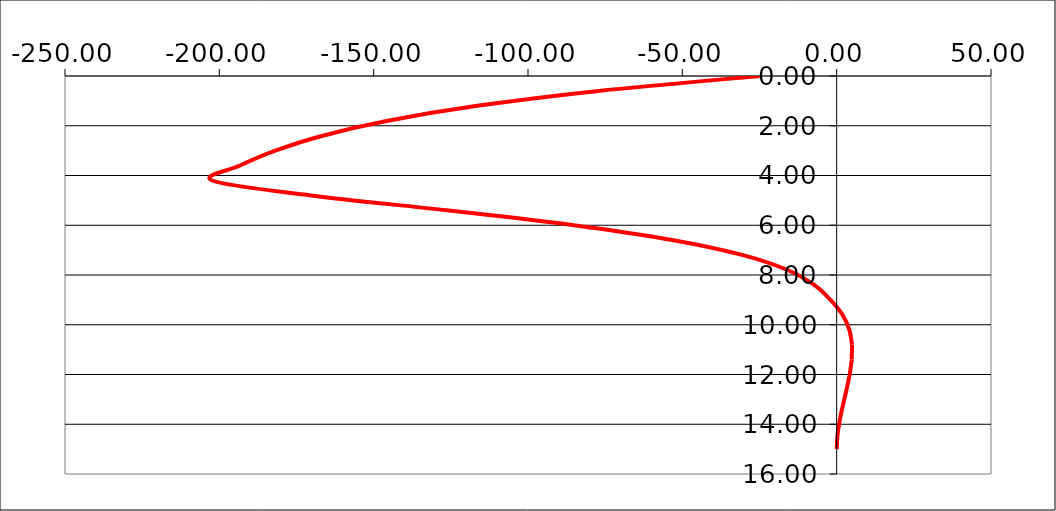
| Category | Series 0 |
|---|---|
| -24.999999999995907 | 0 |
| -77.17624386605394 | 0.6 |
| -116.45017311152287 | 1.2 |
| -145.43160284458872 | 1.8 |
| -166.5233117853595 | 2.4 |
| -181.86802327543228 | 3 |
| -193.30970132865673 | 3.6 |
| -202.36530686541573 | 4.2 |
| -170.35200505953952 | 4.8 |
| -126.31952059444089 | 5.4 |
| -85.19528708133411 | 6 |
| -52.90857749713522 | 6.6 |
| -30.33381757946679 | 7.2 |
| -15.924744423654786 | 7.8 |
| -7.285865312199789 | 8.4 |
| -2.015551921221146 | 9 |
| 1.8913276894671611 | 9.6 |
| 4.080321470363415 | 10.2 |
| 4.960153223503589 | 10.8 |
| 4.901216557217104 | 11.4 |
| 4.226230210545346 | 12 |
| 3.210289167175354 | 12.6 |
| 2.0871086098966884 | 13.2 |
| 1.0587201711911618 | 13.8 |
| 0.3062849043642544 | 14.4 |
| 1.4210854715202004e-14 | 15 |